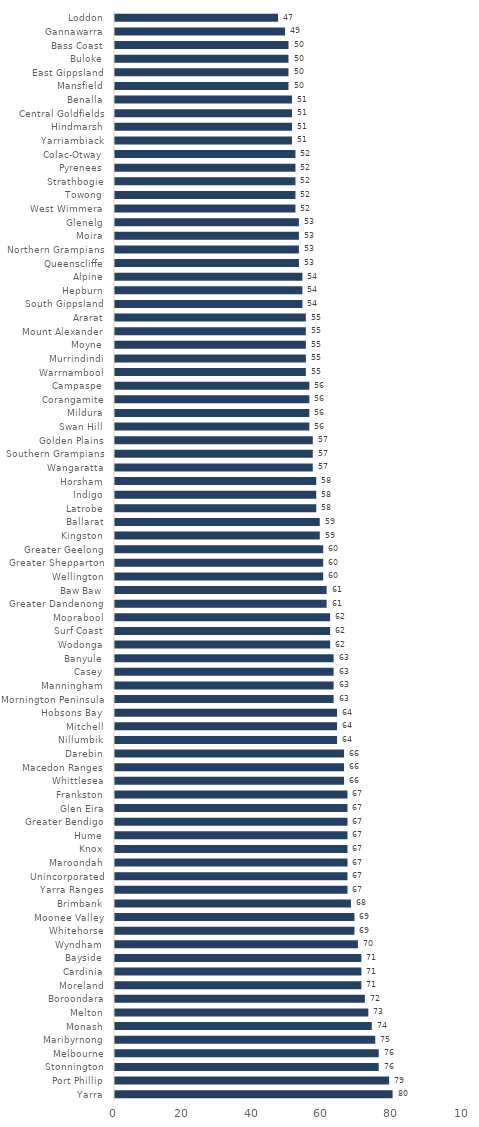
| Category | Series 0 |
|---|---|
| Yarra | 80 |
| Port Phillip | 79 |
| Stonnington | 76 |
| Melbourne | 76 |
| Maribyrnong | 75 |
| Monash | 74 |
| Melton | 73 |
| Boroondara | 72 |
| Moreland | 71 |
| Cardinia | 71 |
| Bayside | 71 |
| Wyndham | 70 |
| Whitehorse | 69 |
| Moonee Valley | 69 |
| Brimbank | 68 |
| Yarra Ranges | 67 |
| Unincorporated | 67 |
| Maroondah | 67 |
| Knox | 67 |
| Hume | 67 |
| Greater Bendigo | 67 |
| Glen Eira | 67 |
| Frankston | 67 |
| Whittlesea | 66 |
| Macedon Ranges | 66 |
| Darebin | 66 |
| Nillumbik | 64 |
| Mitchell | 64 |
| Hobsons Bay | 64 |
| Mornington Peninsula | 63 |
| Manningham | 63 |
| Casey | 63 |
| Banyule | 63 |
| Wodonga | 62 |
| Surf Coast | 62 |
| Moorabool | 62 |
| Greater Dandenong | 61 |
| Baw Baw | 61 |
| Wellington | 60 |
| Greater Shepparton | 60 |
| Greater Geelong | 60 |
| Kingston | 59 |
| Ballarat | 59 |
| Latrobe | 58 |
| Indigo | 58 |
| Horsham | 58 |
| Wangaratta | 57 |
| Southern Grampians | 57 |
| Golden Plains | 57 |
| Swan Hill | 56 |
| Mildura | 56 |
| Corangamite | 56 |
| Campaspe | 56 |
| Warrnambool | 55 |
| Murrindindi | 55 |
| Moyne | 55 |
| Mount Alexander | 55 |
| Ararat | 55 |
| South Gippsland | 54 |
| Hepburn | 54 |
| Alpine | 54 |
| Queenscliffe | 53 |
| Northern Grampians | 53 |
| Moira | 53 |
| Glenelg | 53 |
| West Wimmera | 52 |
| Towong | 52 |
| Strathbogie | 52 |
| Pyrenees | 52 |
| Colac-Otway | 52 |
| Yarriambiack | 51 |
| Hindmarsh | 51 |
| Central Goldfields | 51 |
| Benalla | 51 |
| Mansfield | 50 |
| East Gippsland | 50 |
| Buloke | 50 |
| Bass Coast | 50 |
| Gannawarra | 49 |
| Loddon | 47 |